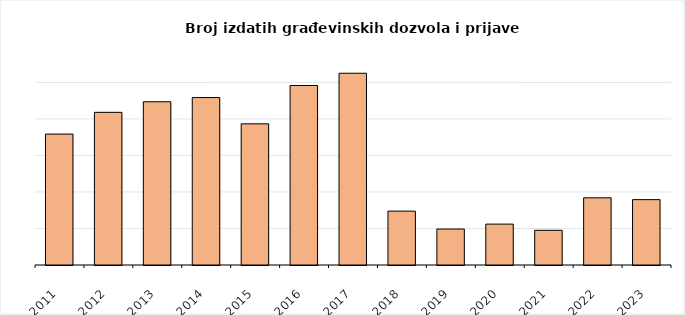
| Category | Broj izdatih građevinskih dozvola i prijava radova |
|---|---|
| 2011.0 | 717 |
| 2012.0 | 836 |
| 2013.0 | 894 |
| 2014.0 | 917 |
| 2015.0 | 773 |
| 2016.0 | 983 |
| 2017.0 | 1050 |
| 2018.0 | 295 |
| 2019.0 | 197 |
| 2020.0 | 224 |
| 2021.0 | 190 |
| 2022.0 | 368 |
| 2023.0 | 358 |